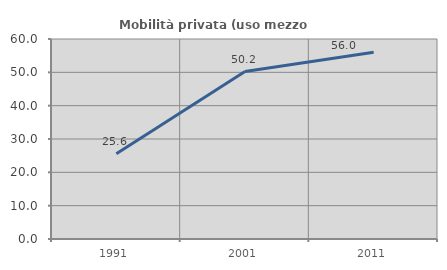
| Category | Mobilità privata (uso mezzo privato) |
|---|---|
| 1991.0 | 25.581 |
| 2001.0 | 50.222 |
| 2011.0 | 56.021 |